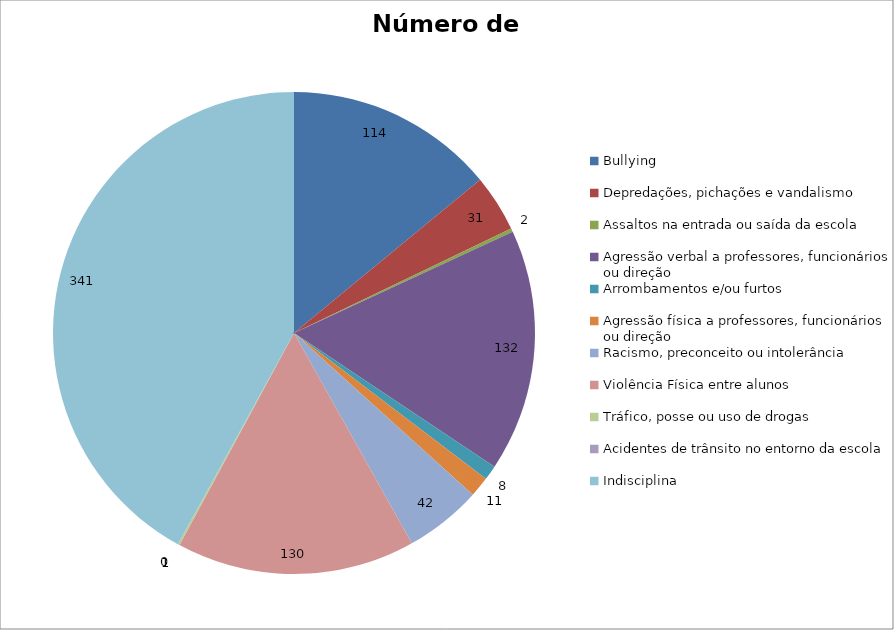
| Category | Número de Casos |
|---|---|
| Bullying | 114 |
| Depredações, pichações e vandalismo | 31 |
| Assaltos na entrada ou saída da escola | 2 |
| Agressão verbal a professores, funcionários ou direção | 132 |
| Arrombamentos e/ou furtos | 8 |
| Agressão física a professores, funcionários ou direção | 11 |
| Racismo, preconceito ou intolerância | 42 |
| Violência Física entre alunos | 130 |
| Tráfico, posse ou uso de drogas | 1 |
| Acidentes de trânsito no entorno da escola | 0 |
| Indisciplina | 341 |